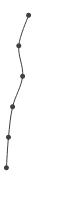
| Category | Series 0 |
|---|---|
| 0.36888706850801234 | 1 |
| 0.20834318360905868 | 2 |
| 0.27125418085838027 | 3 |
| 0.10678127084919325 | 4 |
| 0.039296552055863895 | 5 |
| 0.005354813704882273 | 6 |